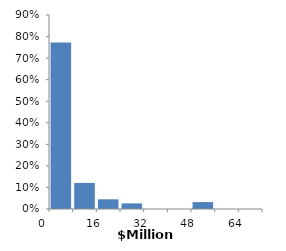
| Category | damage histogram |
|---|---|
| 0           | 0.773 |
| 8           | 0.121 |
| 16           | 0.045 |
| 24           | 0.026 |
| 32           | 0 |
| 40           | 0 |
| 48           | 0.032 |
| 56           | 0 |
| 64           | 0 |